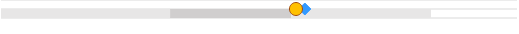
| Category | left | mid start | mid end | right |
|---|---|---|---|---|
| 0 | 0 | 0.393 | 0.282 | 0.325 |